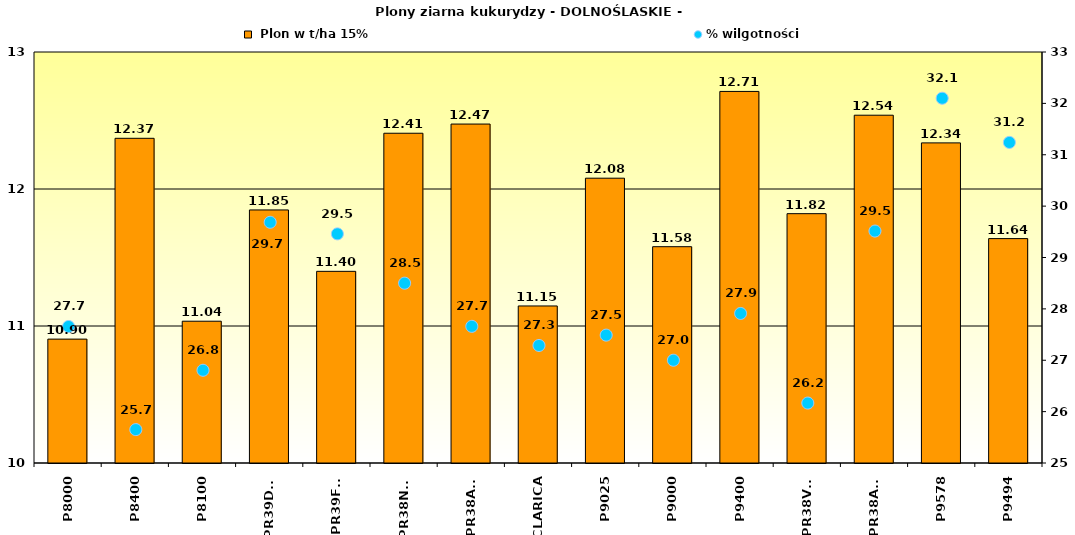
| Category |  Plon w t/ha 15% |
|---|---|
| P8000 | 10.904 |
| P8400 | 12.37 |
| P8100 | 11.035 |
| PR39D23 | 11.847 |
| PR39F58 | 11.399 |
| PR38N86 | 12.407 |
| PR38A79 | 12.474 |
| CLARICA | 11.146 |
| P9025 | 12.079 |
| P9000 | 11.579 |
| P9400 | 12.712 |
| PR38V31 | 11.82 |
| PR38A24 | 12.539 |
| P9578 | 12.337 |
| P9494 | 11.638 |